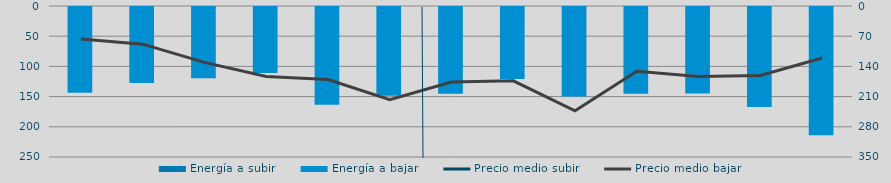
| Category | Energía a subir | Energía a bajar |
|---|---|---|
| J |  | 143.66 |
| A |  | 127.341 |
| S |  | 119.623 |
| O |  | 110.774 |
| N |  | 163.48 |
| D |  | 148.636 |
| E |  | 145.389 |
| F |  | 120.749 |
| M |  | 149.634 |
| A |  | 145.138 |
| M |  | 144.774 |
| J |  | 167.273 |
| J |  | 214.145 |